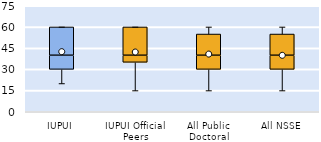
| Category | 25th | 50th | 75th |
|---|---|---|---|
| IUPUI | 30 | 10 | 20 |
| IUPUI Official Peers | 35 | 5 | 20 |
| All Public Doctoral | 30 | 10 | 15 |
| All NSSE | 30 | 10 | 15 |